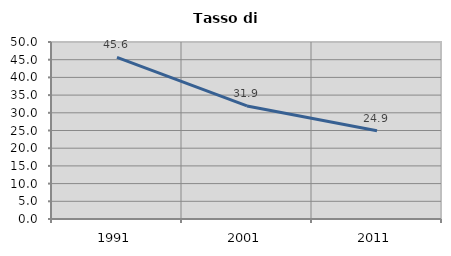
| Category | Tasso di disoccupazione   |
|---|---|
| 1991.0 | 45.649 |
| 2001.0 | 31.947 |
| 2011.0 | 24.927 |